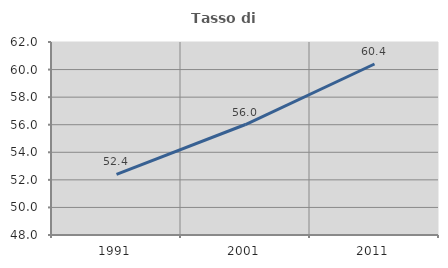
| Category | Tasso di occupazione   |
|---|---|
| 1991.0 | 52.399 |
| 2001.0 | 56.014 |
| 2011.0 | 60.403 |